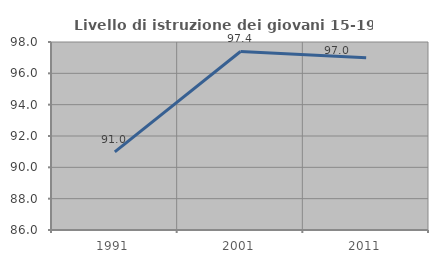
| Category | Livello di istruzione dei giovani 15-19 anni |
|---|---|
| 1991.0 | 90.984 |
| 2001.0 | 97.394 |
| 2011.0 | 96.99 |